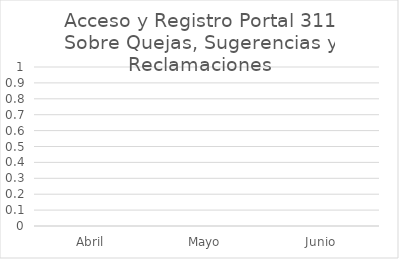
| Category | Series 0 |
|---|---|
| Abril | 0 |
| Mayo | 0 |
| Junio | 0 |